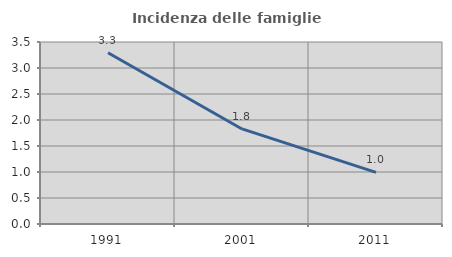
| Category | Incidenza delle famiglie numerose |
|---|---|
| 1991.0 | 3.292 |
| 2001.0 | 1.828 |
| 2011.0 | 0.992 |